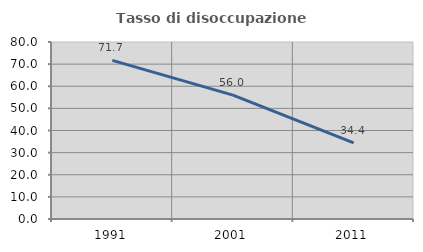
| Category | Tasso di disoccupazione giovanile  |
|---|---|
| 1991.0 | 71.698 |
| 2001.0 | 56 |
| 2011.0 | 34.375 |